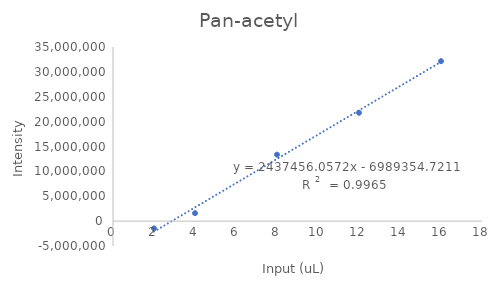
| Category | Series 0 |
|---|---|
| 8.0 | 13364024.963 |
| 4.0 | 1603058.018 |
| 16.0 | 32152880.72 |
| 2.0 | -1472830.495 |
| 12.0 | 21779247.593 |